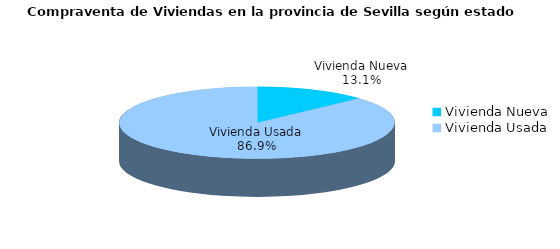
| Category | Series 0 | Series 1 |
|---|---|---|
| Vivienda Nueva | 111 | 0.131 |
| Vivienda Usada | 736 | 0.869 |